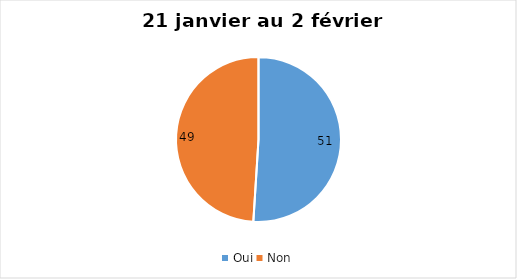
| Category | 21 janvier au 2 février 2022 |
|---|---|
| Oui | 51 |
| Non | 49 |